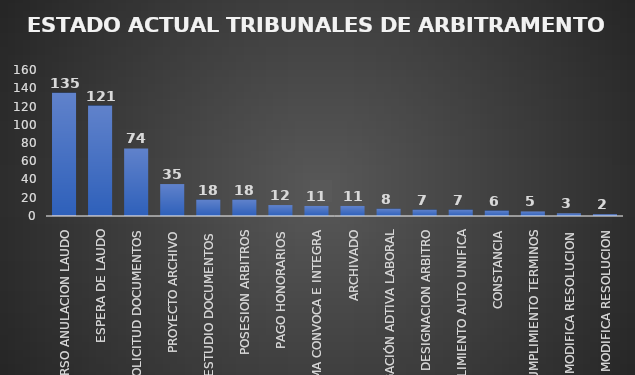
| Category | CANTIDAD | % |
|---|---|---|
| RECURSO ANULACION LAUDO | 135 | 0.279 |
| ESPERA DE LAUDO | 121 | 0.229 |
| SOLICITUD DOCUMENTOS | 74 | 0.148 |
| PROYECTO ARCHIVO | 35 | 0.078 |
| ESTUDIO DOCUMENTOS  | 18 | 0.04 |
| POSESION ARBITROS | 18 | 0.035 |
| PAGO HONORARIOS | 12 | 0.022 |
| FIRMA CONVOCA E INTEGRA | 11 | 0.026 |
| ARCHIVADO | 11 | 0.028 |
| INVESTIGACIÓN ADTIVA LABORAL | 8 | 0.014 |
| DESIGNACION ARBITRO | 7 | 0.017 |
| CUMPLIMIENTO AUTO UNIFICA | 7 | 0.014 |
| CONSTANCIA | 6 | 0.016 |
| AUTO CUMPLIMIENTO TERMINOS | 5 | 0.011 |
| PROYECTO MODIFICA RESOLUCION | 3 | 0.006 |
| FIRMA MODIFICA RESOLUCION | 2 | 0.004 |